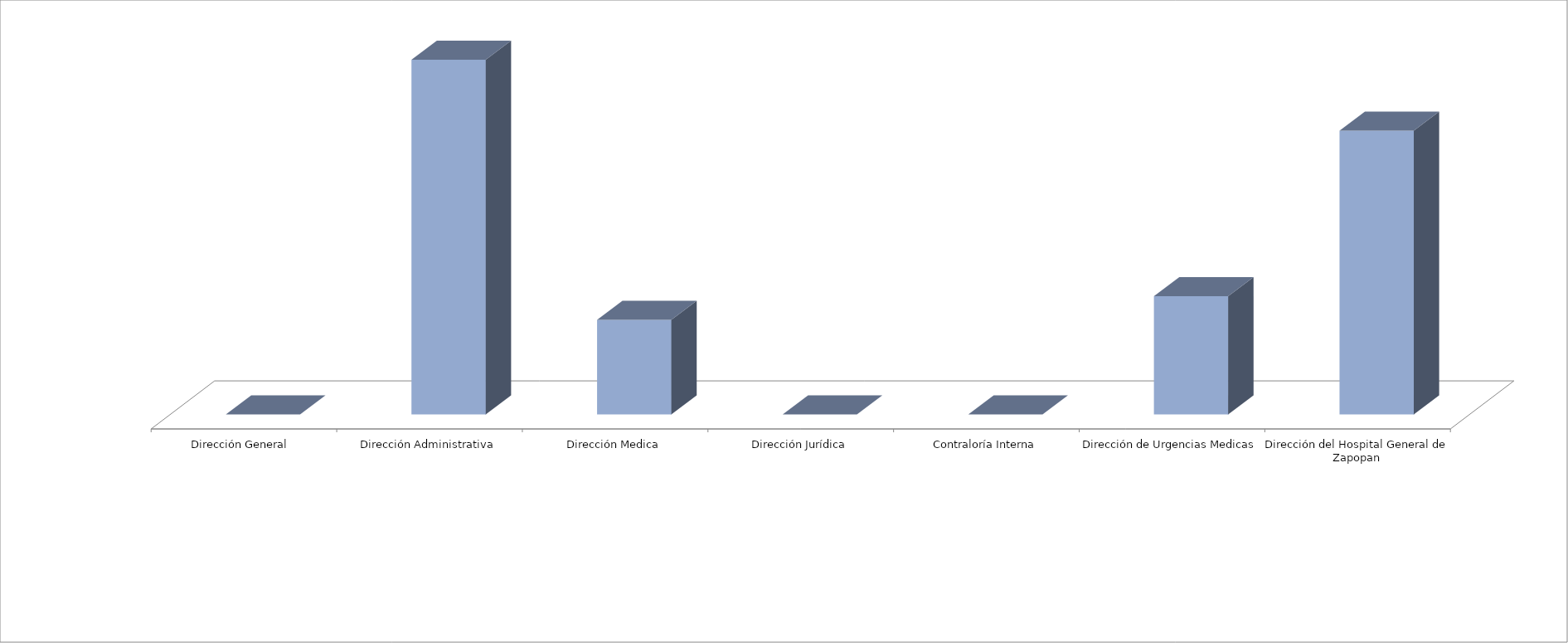
| Category | Series 0 | Series 1 |
|---|---|---|
| Dirección General  |  | 0 |
| Dirección Administrativa |  | 15 |
| Dirección Medica |  | 4 |
| Dirección Jurídica |  | 0 |
| Contraloría Interna |  | 0 |
| Dirección de Urgencias Medicas |  | 5 |
| Dirección del Hospital General de Zapopan |  | 12 |